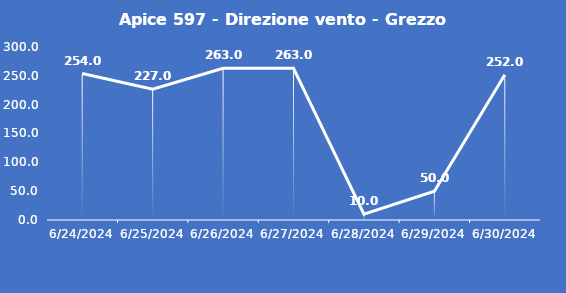
| Category | Apice 597 - Direzione vento - Grezzo (°N) |
|---|---|
| 6/24/24 | 254 |
| 6/25/24 | 227 |
| 6/26/24 | 263 |
| 6/27/24 | 263 |
| 6/28/24 | 10 |
| 6/29/24 | 50 |
| 6/30/24 | 252 |